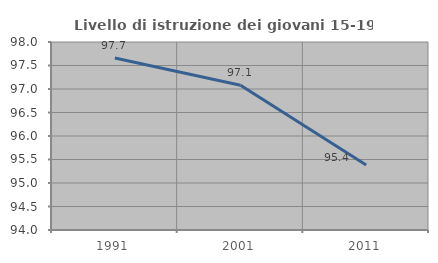
| Category | Livello di istruzione dei giovani 15-19 anni |
|---|---|
| 1991.0 | 97.661 |
| 2001.0 | 97.08 |
| 2011.0 | 95.385 |